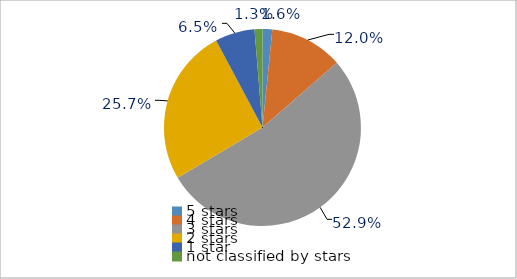
| Category | Series 0 |
|---|---|
| 5 stars | 1.6 |
| 4 stars | 12 |
| 3 stars | 52.9 |
| 2 stars | 25.7 |
| 1 star | 6.5 |
| not classified by stars | 1.3 |